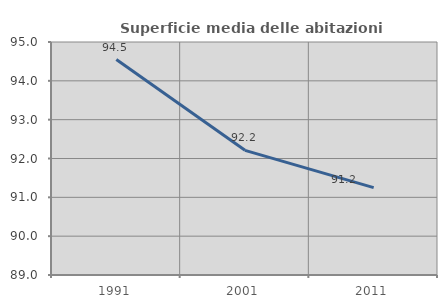
| Category | Superficie media delle abitazioni occupate |
|---|---|
| 1991.0 | 94.548 |
| 2001.0 | 92.21 |
| 2011.0 | 91.249 |